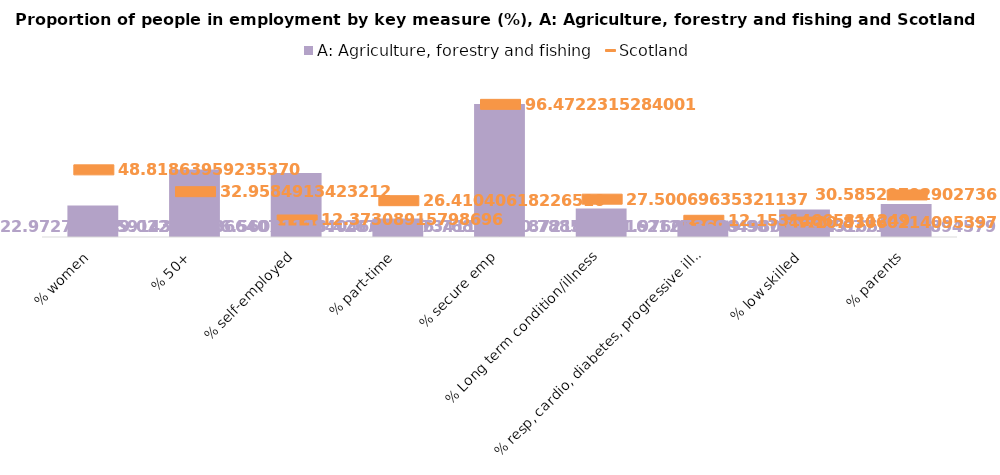
| Category | A: Agriculture, forestry and fishing |
|---|---|
| % women | 22.973 |
| % 50+ | 49.022 |
| % self-employed | 46.56 |
| % part-time | 13.427 |
| % secure emp | 96.769 |
| % Long term condition/illness | 20.789 |
| % resp, cardio, diabetes, progressive illness | 11.977 |
| % low skilled | 19.987 |
| % parents | 24.077 |